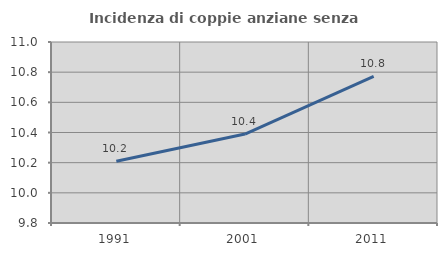
| Category | Incidenza di coppie anziane senza figli  |
|---|---|
| 1991.0 | 10.209 |
| 2001.0 | 10.39 |
| 2011.0 | 10.773 |